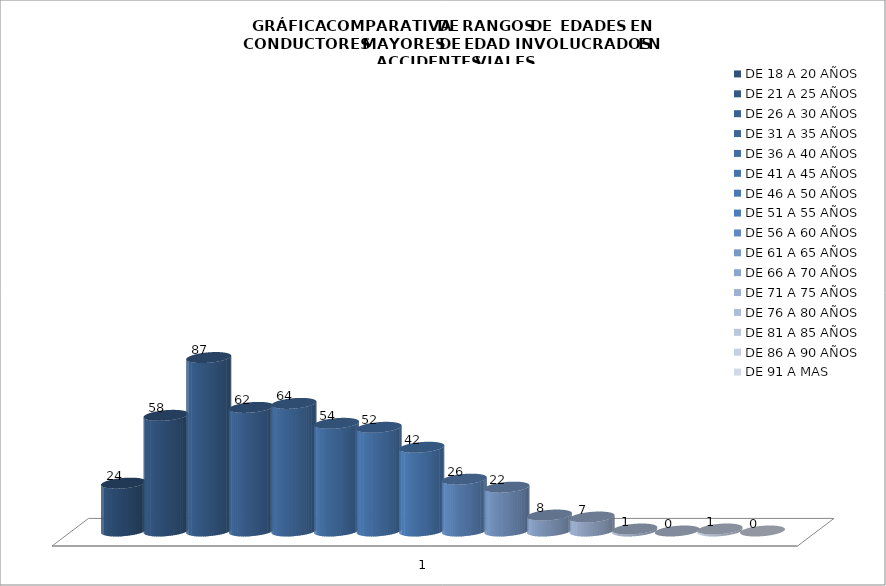
| Category | DE 18 A 20 AÑOS | DE 21 A 25 AÑOS | DE 26 A 30 AÑOS | DE 31 A 35 AÑOS | DE 36 A 40 AÑOS | DE 41 A 45 AÑOS | DE 46 A 50 AÑOS | DE 51 A 55 AÑOS | DE 56 A 60 AÑOS | DE 61 A 65 AÑOS | DE 66 A 70 AÑOS | DE 71 A 75 AÑOS | DE 76 A 80 AÑOS | DE 81 A 85 AÑOS | DE 86 A 90 AÑOS | DE 91 A MAS |
|---|---|---|---|---|---|---|---|---|---|---|---|---|---|---|---|---|
| 0 | 24 | 58 | 87 | 62 | 64 | 54 | 52 | 42 | 26 | 22 | 8 | 7 | 1 | 0 | 1 | 0 |